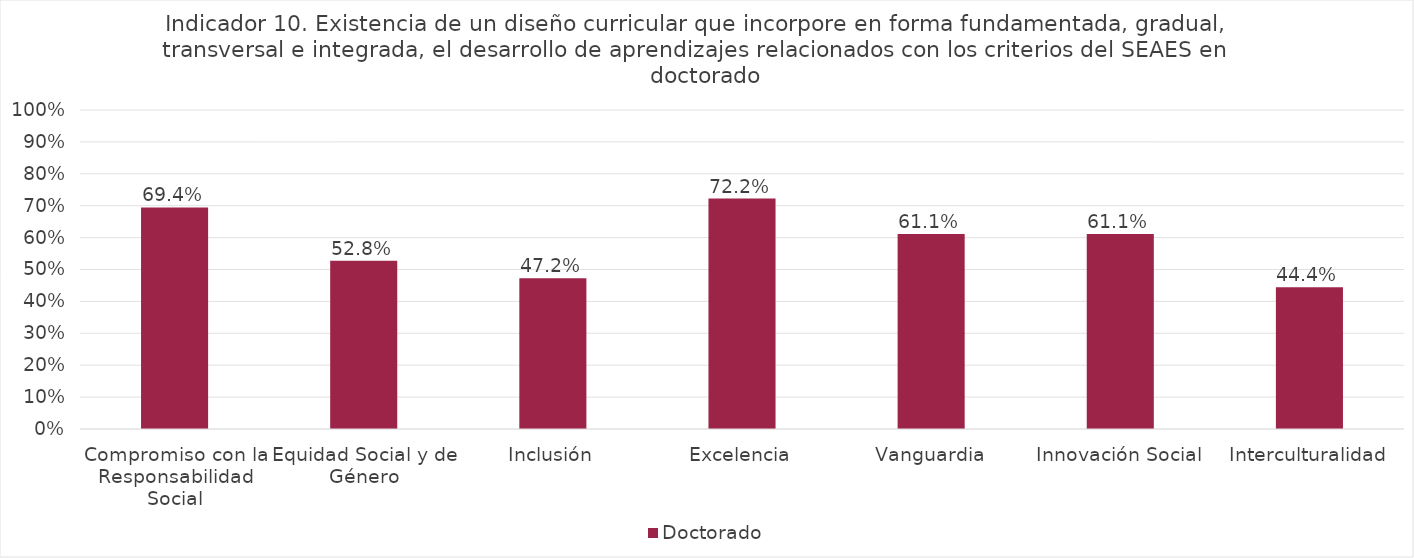
| Category | Doctorado |
|---|---|
| Compromiso con la Responsabilidad Social | 0.694 |
| Equidad Social y de Género | 0.528 |
| Inclusión | 0.472 |
| Excelencia | 0.722 |
| Vanguardia | 0.611 |
| Innovación Social | 0.611 |
| Interculturalidad | 0.444 |